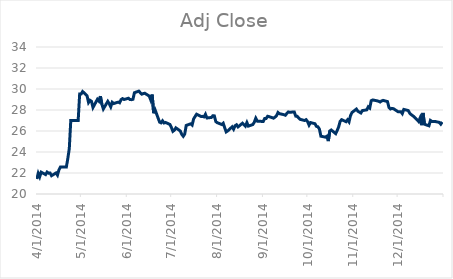
| Category | Adj Close |
|---|---|
| 4/1/14 | 21.43 |
| 4/2/14 | 21.97 |
| 4/3/14 | 21.635 |
| 4/4/14 | 22.08 |
| 4/7/14 | 21.85 |
| 4/8/14 | 22.09 |
| 4/9/14 | 21.985 |
| 4/10/14 | 22 |
| 4/11/14 | 21.745 |
| 4/14/14 | 22.005 |
| 4/15/14 | 21.795 |
| 4/16/14 | 22.3 |
| 4/17/14 | 22.565 |
| 4/18/14 | 22.565 |
| 4/21/14 | 22.565 |
| 4/22/14 | 23.375 |
| 4/23/14 | 24.34 |
| 4/24/14 | 27 |
| 4/25/14 | 27 |
| 4/28/14 | 27 |
| 4/29/14 | 27 |
| 4/30/14 | 29.52 |
| 5/1/14 | 29.52 |
| 5/2/14 | 29.76 |
| 5/5/14 | 29.355 |
| 5/6/14 | 28.715 |
| 5/7/14 | 28.92 |
| 5/8/14 | 28.825 |
| 5/9/14 | 28.24 |
| 5/12/14 | 29.02 |
| 5/13/14 | 28.85 |
| 5/14/14 | 29.32 |
| 5/15/14 | 28.55 |
| 5/16/14 | 28.1 |
| 5/19/14 | 28.82 |
| 5/20/14 | 28.595 |
| 5/21/14 | 28.3 |
| 5/22/14 | 28.735 |
| 5/23/14 | 28.61 |
| 5/26/14 | 28.75 |
| 5/27/14 | 28.69 |
| 5/28/14 | 28.995 |
| 5/29/14 | 29.085 |
| 5/30/14 | 29 |
| 6/2/14 | 29.12 |
| 6/3/14 | 28.995 |
| 6/4/14 | 28.985 |
| 6/5/14 | 29.02 |
| 6/6/14 | 29.645 |
| 6/9/14 | 29.8 |
| 6/10/14 | 29.64 |
| 6/11/14 | 29.505 |
| 6/12/14 | 29.57 |
| 6/13/14 | 29.595 |
| 6/16/14 | 29.33 |
| 6/17/14 | 28.965 |
| 6/18/14 | 29.47 |
| 6/19/14 | 27.7 |
| 6/20/14 | 28 |
| 6/23/14 | 26.85 |
| 6/24/14 | 26.78 |
| 6/25/14 | 26.97 |
| 6/26/14 | 26.765 |
| 6/27/14 | 26.815 |
| 6/30/14 | 26.625 |
| 7/1/14 | 26.33 |
| 7/2/14 | 25.97 |
| 7/3/14 | 26.075 |
| 7/4/14 | 26.3 |
| 7/7/14 | 26 |
| 7/8/14 | 25.68 |
| 7/9/14 | 25.5 |
| 7/10/14 | 25.715 |
| 7/11/14 | 26.53 |
| 7/14/14 | 26.685 |
| 7/15/14 | 26.565 |
| 7/16/14 | 27.15 |
| 7/17/14 | 27.38 |
| 7/18/14 | 27.6 |
| 7/21/14 | 27.38 |
| 7/22/14 | 27.395 |
| 7/23/14 | 27.345 |
| 7/24/14 | 27.595 |
| 7/25/14 | 27.24 |
| 7/28/14 | 27.29 |
| 7/29/14 | 27.455 |
| 7/30/14 | 27.44 |
| 7/31/14 | 26.89 |
| 8/1/14 | 26.79 |
| 8/4/14 | 26.62 |
| 8/5/14 | 26.74 |
| 8/6/14 | 26.315 |
| 8/7/14 | 25.915 |
| 8/8/14 | 26.005 |
| 8/11/14 | 26.395 |
| 8/12/14 | 26.17 |
| 8/13/14 | 26.5 |
| 8/14/14 | 26.595 |
| 8/15/14 | 26.39 |
| 8/18/14 | 26.74 |
| 8/19/14 | 26.6 |
| 8/20/14 | 26.465 |
| 8/21/14 | 26.805 |
| 8/22/14 | 26.465 |
| 8/25/14 | 26.615 |
| 8/26/14 | 26.84 |
| 8/27/14 | 27.215 |
| 8/28/14 | 26.94 |
| 8/29/14 | 26.935 |
| 9/1/14 | 26.9 |
| 9/2/14 | 27.19 |
| 9/3/14 | 27.195 |
| 9/4/14 | 27.405 |
| 9/5/14 | 27.37 |
| 9/8/14 | 27.22 |
| 9/9/14 | 27.325 |
| 9/10/14 | 27.45 |
| 9/11/14 | 27.765 |
| 9/12/14 | 27.65 |
| 9/15/14 | 27.555 |
| 9/16/14 | 27.5 |
| 9/17/14 | 27.675 |
| 9/18/14 | 27.815 |
| 9/19/14 | 27.785 |
| 9/22/14 | 27.815 |
| 9/23/14 | 27.415 |
| 9/24/14 | 27.4 |
| 9/25/14 | 27.24 |
| 9/26/14 | 27.11 |
| 9/29/14 | 27 |
| 9/30/14 | 27.08 |
| 10/1/14 | 26.9 |
| 10/2/14 | 26.565 |
| 10/3/14 | 26.805 |
| 10/6/14 | 26.69 |
| 10/7/14 | 26.44 |
| 10/8/14 | 26.4 |
| 10/9/14 | 26.185 |
| 10/10/14 | 25.505 |
| 10/13/14 | 25.415 |
| 10/14/14 | 25.5 |
| 10/15/14 | 25.04 |
| 10/16/14 | 26 |
| 10/17/14 | 26.095 |
| 10/20/14 | 25.75 |
| 10/21/14 | 26.045 |
| 10/22/14 | 26.395 |
| 10/23/14 | 26.915 |
| 10/24/14 | 27.08 |
| 10/27/14 | 26.885 |
| 10/28/14 | 27.065 |
| 10/29/14 | 26.87 |
| 10/30/14 | 27.47 |
| 10/31/14 | 27.76 |
| 11/3/14 | 28.09 |
| 11/4/14 | 27.88 |
| 11/5/14 | 27.8 |
| 11/6/14 | 27.715 |
| 11/7/14 | 27.945 |
| 11/10/14 | 28.015 |
| 11/11/14 | 28.3 |
| 11/12/14 | 28.185 |
| 11/13/14 | 28.89 |
| 11/14/14 | 28.955 |
| 11/17/14 | 28.875 |
| 11/18/14 | 28.83 |
| 11/19/14 | 28.76 |
| 11/20/14 | 28.865 |
| 11/21/14 | 28.915 |
| 11/24/14 | 28.805 |
| 11/25/14 | 28.235 |
| 11/26/14 | 28.1 |
| 11/27/14 | 28.155 |
| 11/28/14 | 28.125 |
| 12/1/14 | 27.845 |
| 12/2/14 | 27.845 |
| 12/3/14 | 27.84 |
| 12/4/14 | 27.655 |
| 12/5/14 | 28.055 |
| 12/8/14 | 27.95 |
| 12/9/14 | 27.7 |
| 12/10/14 | 27.565 |
| 12/11/14 | 27.46 |
| 12/12/14 | 27.35 |
| 12/15/14 | 26.91 |
| 12/16/14 | 27.235 |
| 12/17/14 | 26.555 |
| 12/18/14 | 27.72 |
| 12/19/14 | 26.645 |
| 12/22/14 | 26.495 |
| 12/23/14 | 27.005 |
| 12/24/14 | 26.91 |
| 12/25/14 | 26.91 |
| 12/26/14 | 26.91 |
| 12/29/14 | 26.82 |
| 12/30/14 | 26.655 |
| 12/31/14 | 26.86 |